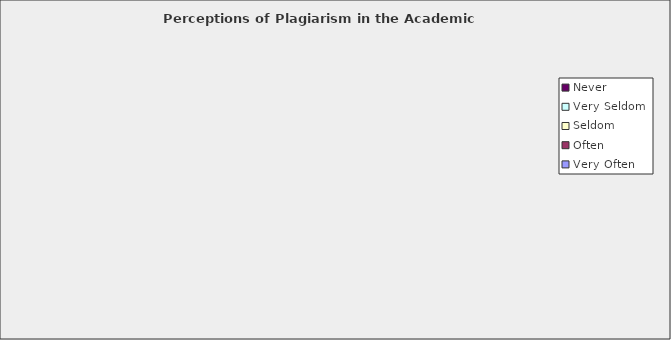
| Category | Very Often | Often | Seldom | Very Seldom | Never |
|---|---|---|---|---|---|
| Plagiarism | 36 | 209 | 181 | 128 | 83 |
| Guidelines on group work or collaboration | 51 | 224 | 182 | 90 | 88 |
| Proper citation/referencing of in-print sources | 84 | 211 | 161 | 96 | 81 |
| Proper citation/referencing of internet sources | 61 | 154 | 186 | 112 | 109 |
| Incorporating another’s course lab data as your own | 26 | 96 | 155 | 118 | 234 |
| Incorporating another’s research data as your own | 42 | 112 | 163 | 114 | 201 |